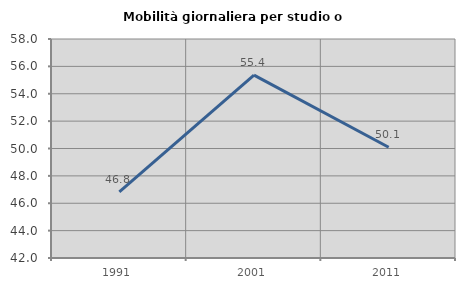
| Category | Mobilità giornaliera per studio o lavoro |
|---|---|
| 1991.0 | 46.828 |
| 2001.0 | 55.363 |
| 2011.0 | 50.095 |